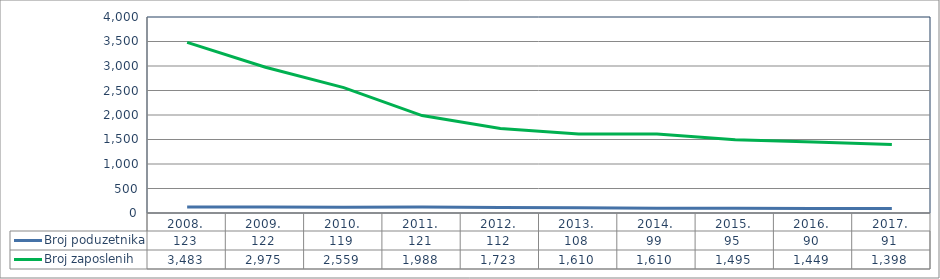
| Category | Broj poduzetnika | Broj zaposlenih |
|---|---|---|
| 2008. | 123 | 3483 |
| 2009. | 122 | 2975 |
| 2010. | 119 | 2559 |
| 2011. | 121 | 1988 |
| 2012. | 112 | 1723 |
| 2013. | 108 | 1610 |
| 2014. | 99 | 1610 |
| 2015. | 95 | 1495 |
| 2016. | 90 | 1449 |
| 2017. | 91 | 1398 |